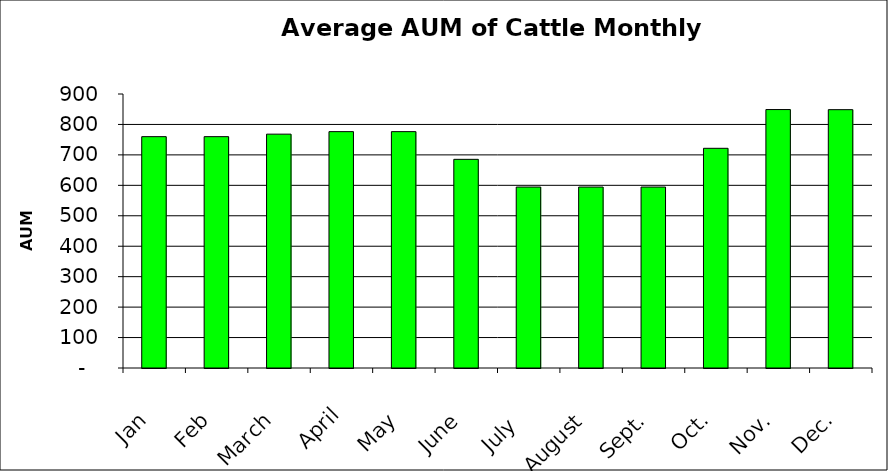
| Category | Series 0 |
|---|---|
| Jan | 759.9 |
| Feb | 759.9 |
| March | 768.15 |
| April | 776.4 |
| May | 776.4 |
| June | 685.4 |
| July  | 594.4 |
| August | 594.4 |
| Sept. | 594.4 |
| Oct. | 721.65 |
| Nov. | 848.9 |
| Dec. | 848.55 |